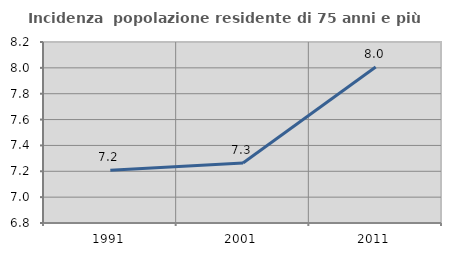
| Category | Incidenza  popolazione residente di 75 anni e più |
|---|---|
| 1991.0 | 7.208 |
| 2001.0 | 7.264 |
| 2011.0 | 8.007 |